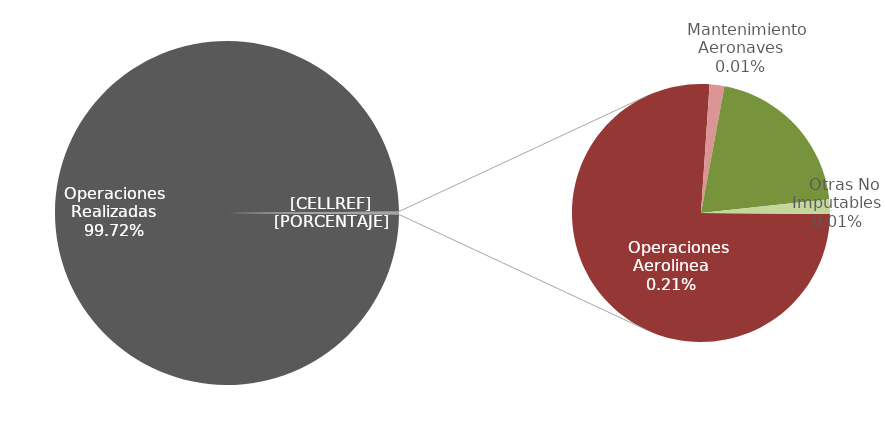
| Category | Series 0 |
|---|---|
| Operaciones Realizadas | 19560 |
|    Operaciones Aerolinea | 41 |
|    Mantenimiento Aeronaves | 1 |
|    Otras Imputables | 0 |
|    Meteorologia | 11 |
|    Otras No Imputables | 1 |